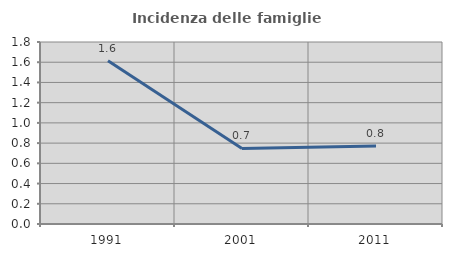
| Category | Incidenza delle famiglie numerose |
|---|---|
| 1991.0 | 1.615 |
| 2001.0 | 0.747 |
| 2011.0 | 0.771 |